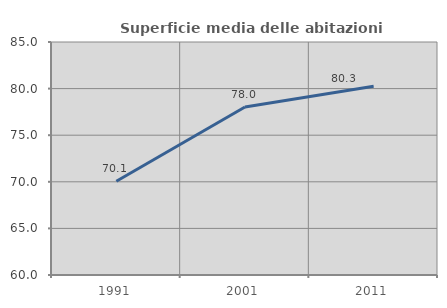
| Category | Superficie media delle abitazioni occupate |
|---|---|
| 1991.0 | 70.059 |
| 2001.0 | 78.018 |
| 2011.0 | 80.25 |